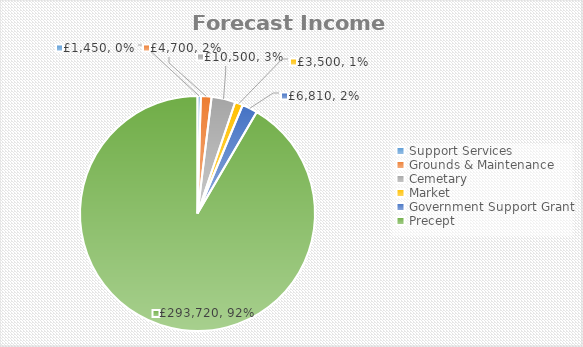
| Category | Series 0 |
|---|---|
| Support Services | 1450 |
| Grounds & Maintenance | 4700 |
| Cemetary | 10500 |
| Market   | 3500 |
| Government Support Grant | 6810 |
| Precept | 293720 |